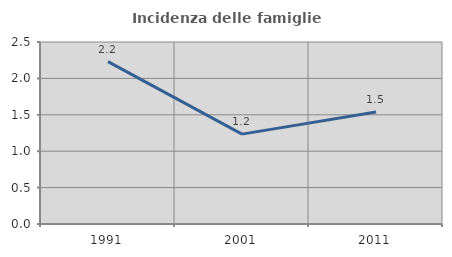
| Category | Incidenza delle famiglie numerose |
|---|---|
| 1991.0 | 2.23 |
| 2001.0 | 1.235 |
| 2011.0 | 1.538 |